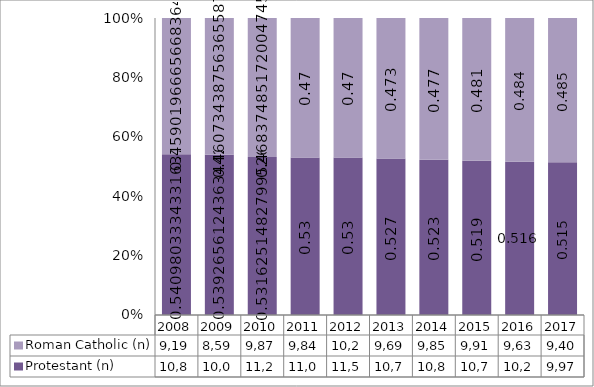
| Category | Protestant (n) | Roman Catholic (n) |
|---|---|---|
| 2008.0 | 10838 | 9196 |
| 2009.0 | 10060 | 8595 |
| 2010.0 | 11204 | 9872 |
| 2011.0 | 11099 | 9847 |
| 2012.0 | 11585 | 10276 |
| 2013.0 | 10779 | 9691 |
| 2014.0 | 10801 | 9850 |
| 2015.0 | 10710 | 9910 |
| 2016.0 | 10258 | 9638 |
| 2017.0 | 9970 | 9402 |